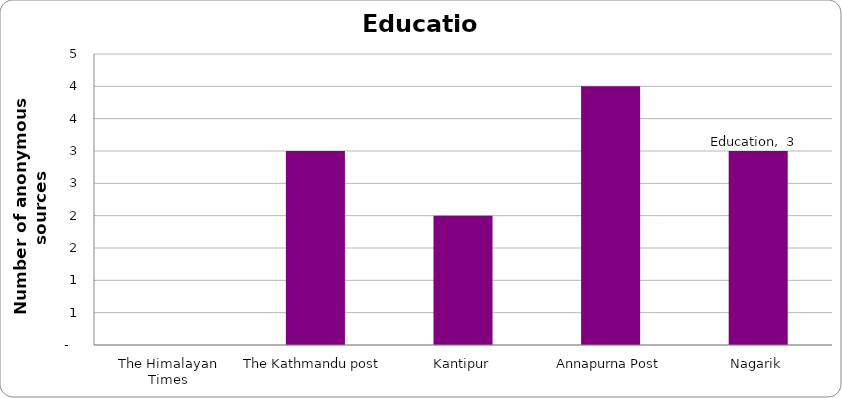
| Category | Education |
|---|---|
| The Himalayan Times | 0 |
| The Kathmandu post | 3 |
| Kantipur | 2 |
| Annapurna Post | 4 |
| Nagarik | 3 |